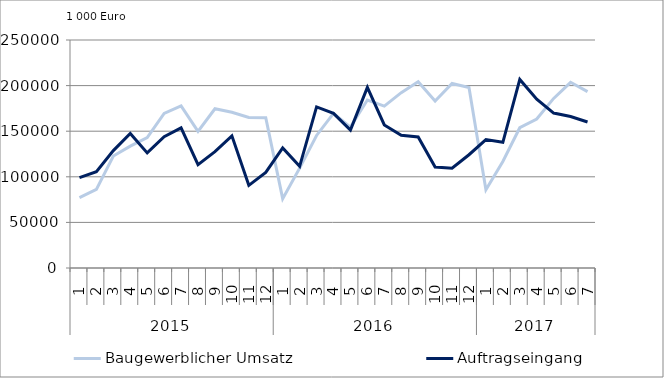
| Category | Baugewerblicher Umsatz | Auftragseingang |
|---|---|---|
| 0 | 77137.228 | 99023.008 |
| 1 | 86257.027 | 105491.844 |
| 2 | 122760.234 | 128704.324 |
| 3 | 133614.814 | 147438.665 |
| 4 | 142869.83 | 126182.175 |
| 5 | 169564.381 | 143879.815 |
| 6 | 177708.819 | 153660.001 |
| 7 | 149762.789 | 113338.261 |
| 8 | 174633.481 | 127520.775 |
| 9 | 170827.145 | 144931.886 |
| 10 | 165122.384 | 90621.16 |
| 11 | 164674.971 | 104795.622 |
| 12 | 76043.538 | 131571.482 |
| 13 | 109483.268 | 111467.248 |
| 14 | 145343.559 | 176673.268 |
| 15 | 169660.551 | 169566.96 |
| 16 | 154554.865 | 151228.165 |
| 17 | 184236.137 | 198035.655 |
| 18 | 177444.278 | 156900.898 |
| 19 | 192230.472 | 145537.167 |
| 20 | 204178.065 | 143616.217 |
| 21 | 183173.849 | 110770.94 |
| 22 | 202302.279 | 109384.188 |
| 23 | 197832.096 | 124193.91 |
| 24 | 85701.947 | 140751.008 |
| 25 | 116743.276 | 137863.383 |
| 26 | 153810.055 | 206710.579 |
| 27 | 163342.989 | 185183.797 |
| 28 | 185946.221 | 169878.51 |
| 29 | 203627.91 | 166148.392 |
| 30 | 193377.256 | 160134.206 |